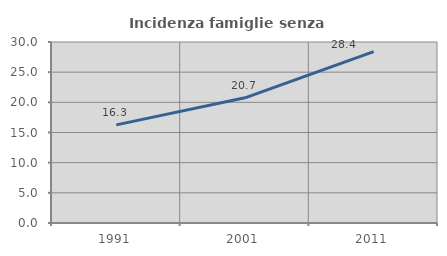
| Category | Incidenza famiglie senza nuclei |
|---|---|
| 1991.0 | 16.264 |
| 2001.0 | 20.745 |
| 2011.0 | 28.411 |